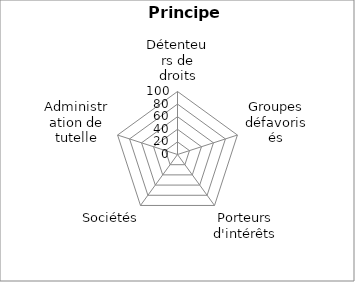
| Category | Series 0 |
|---|---|
| Détenteurs de droits | 0 |
| Groupes défavorisés | 0 |
| Porteurs d'intérêts | 0 |
| Sociétés | 0 |
| Administration de tutelle | 0 |